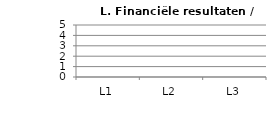
| Category | Gemiddelde |
|---|---|
| L1 | 0 |
| L2 | 0 |
| L3 | 0 |